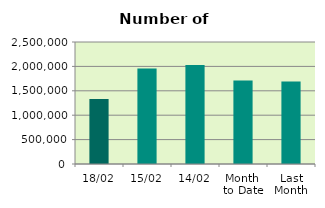
| Category | Series 0 |
|---|---|
| 18/02 | 1332954 |
| 15/02 | 1957182 |
| 14/02 | 2029694 |
| Month 
to Date | 1710824.833 |
| Last
Month | 1692009 |